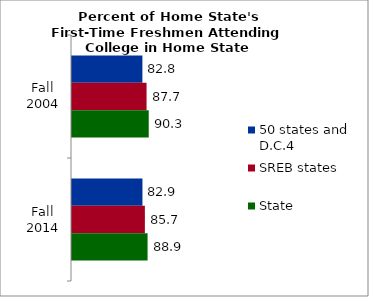
| Category | 50 states and D.C.4 | SREB states | State |
|---|---|---|---|
| Fall 2004 | 82.827 | 87.715 | 90.268 |
| Fall 2014 | 82.888 | 85.739 | 88.906 |